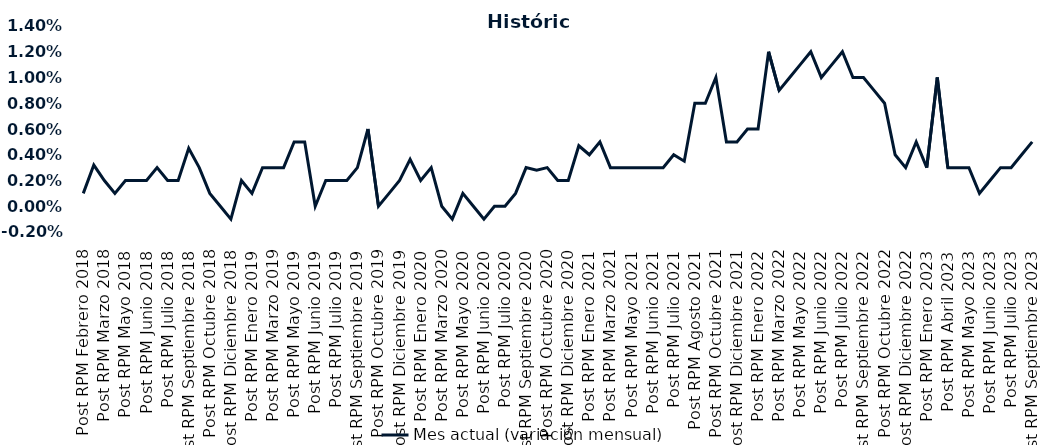
| Category | Mes actual (variación mensual)  |
|---|---|
| Post RPM Febrero 2018 | 0.001 |
| Pre RPM Marzo 2018 | 0.003 |
| Post RPM Marzo 2018 | 0.002 |
| Pre RPM Mayo 2018 | 0.001 |
| Post RPM Mayo 2018 | 0.002 |
| Pre RPM Junio 2018 | 0.002 |
| Post RPM Junio 2018 | 0.002 |
| Pre RPM Julio 2018 | 0.003 |
| Post RPM Julio 2018 | 0.002 |
| Pre RPM Septiembre 2018 | 0.002 |
| Post RPM Septiembre 2018 | 0.004 |
| Pre RPM Octubre 2018 | 0.003 |
| Post RPM Octubre 2018 | 0.001 |
| Pre RPM Diciembre 2018 | 0 |
| Post RPM Diciembre 2018 | -0.001 |
| Pre RPM Enero 2019 | 0.002 |
| Post RPM Enero 2019 | 0.001 |
| Pre RPM Marzo 2019 | 0.003 |
| Post RPM Marzo 2019 | 0.003 |
| Pre RPM Mayo 2019 | 0.003 |
| Post RPM Mayo 2019 | 0.005 |
| Pre RPM Junio 2019 | 0.005 |
| Post RPM Junio 2019 | 0 |
| Pre RPM Julio 2019 | 0.002 |
| Post RPM Julio 2019 | 0.002 |
| Pre RPM Septiembre 2019 | 0.002 |
| Post RPM Septiembre 2019 | 0.003 |
| Pre RPM Octubre 2019 | 0.006 |
| Post RPM Octubre 2019 | 0 |
| Pre RPM Diciembre 2019 | 0.001 |
| Post RPM Diciembre 2019 | 0.002 |
| Pre RPM Enero 2020 | 0.004 |
| Post RPM Enero 2020 | 0.002 |
| Pre RPM Marzo 2020 | 0.003 |
| Post RPM Marzo 2020 | 0 |
| Pre RPM Mayo 2020 | -0.001 |
| Post RPM Mayo 2020 | 0.001 |
| Pre RPM Junio 2020 | 0 |
| Post RPM Junio 2020 | -0.001 |
| Pre RPM Julio 2020 | 0 |
| Post RPM Julio 2020 | 0 |
| Pre RPM Septiembre 2020 | 0.001 |
| Post RPM Septiembre 2020 | 0.003 |
| Pre RPM Octubre 2020 | 0.003 |
| Post RPM Octubre 2020 | 0.003 |
| Pre RPM Diciembre 2020 | 0.002 |
| Post RPM Diciembre 2020 | 0.002 |
| Pre RPM Enero 2021 | 0.005 |
| Post RPM Enero 2021 | 0.004 |
| Pre RPM Marzo 2021 | 0.005 |
| Post RPM Marzo 2021 | 0.003 |
| Pre RPM Mayo 2021 | 0.003 |
| Post RPM Mayo 2021 | 0.003 |
| Pre RPM Junio 2021 | 0.003 |
| Post RPM Junio 2021 | 0.003 |
| Pre RPM Julio 2021 | 0.003 |
| Post RPM Julio 2021 | 0.004 |
| Pre RPM Agosto 2021 | 0.004 |
| Post RPM Agosto 2021 | 0.008 |
| Pre RPM Octubre 2021 | 0.008 |
| Post RPM Octubre 2021 | 0.01 |
| Pre RPM Diciembre 2021 | 0.005 |
| Post RPM Diciembre 2021 | 0.005 |
| Pre RPM Enero 2022 | 0.006 |
| Post RPM Enero 2022 | 0.006 |
| Pre RPM Marzo 2022 | 0.012 |
| Post RPM Marzo 2022 | 0.009 |
| Pre RPM Mayo 2022 | 0.01 |
| Post RPM Mayo 2022 | 0.011 |
| Pre RPM Junio 2022 | 0.012 |
| Post RPM Junio 2022 | 0.01 |
| Pre RPM Julio 2022 | 0.011 |
| Post RPM Julio 2022 | 0.012 |
| Pre RPM Septiembre 2022 | 0.01 |
| Post RPM Septiembre 2022 | 0.01 |
| Pre RPM Octubre 2022 | 0.009 |
| Post RPM Octubre 2022 | 0.008 |
| Pre RPM Diciembre 2022 | 0.004 |
| Post RPM Diciembre 2022 | 0.003 |
| Pre RPM Enero 2023 | 0.005 |
| Post RPM Enero 2023 | 0.003 |
| Pre RPM Abril 2023 | 0.01 |
| Post RPM Abril 2023 | 0.003 |
| Pre RPM Mayo 2023 | 0.003 |
| Post RPM Mayo 2023 | 0.003 |
| Pre RPM Junio 2023 | 0.001 |
| Post RPM Junio 2023 | 0.002 |
| Pre RPM Julio 2023 | 0.003 |
| Post RPM Julio 2023 | 0.003 |
| Pre RPM Septiembre 2023 | 0.004 |
| Post RPM Septiembre 2023 | 0.005 |